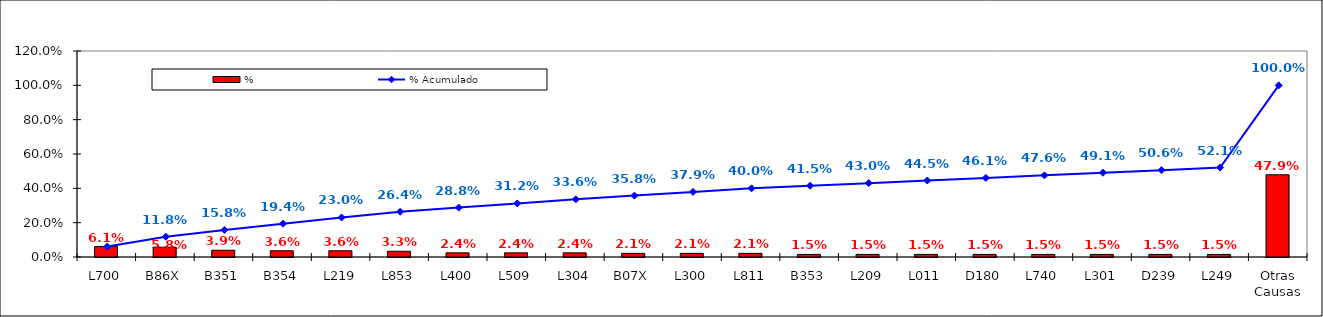
| Category | % |
|---|---|
| L700 | 0.061 |
| B86X | 0.058 |
| B351 | 0.039 |
| B354 | 0.036 |
| L219 | 0.036 |
| L853 | 0.033 |
| L400 | 0.024 |
| L509 | 0.024 |
| L304 | 0.024 |
| B07X | 0.021 |
| L300 | 0.021 |
| L811 | 0.021 |
| B353 | 0.015 |
| L209 | 0.015 |
| L011 | 0.015 |
| D180 | 0.015 |
| L740 | 0.015 |
| L301 | 0.015 |
| D239 | 0.015 |
| L249 | 0.015 |
| Otras Causas | 0.479 |